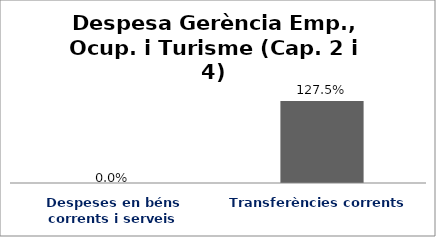
| Category | Series 0 |
|---|---|
| Despeses en béns corrents i serveis | 0 |
| Transferències corrents | 1.275 |